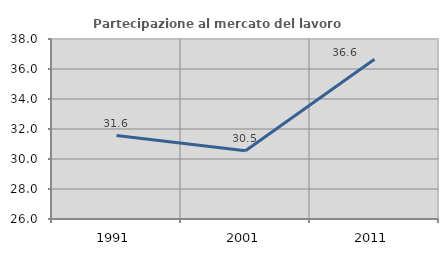
| Category | Partecipazione al mercato del lavoro  femminile |
|---|---|
| 1991.0 | 31.562 |
| 2001.0 | 30.547 |
| 2011.0 | 36.644 |